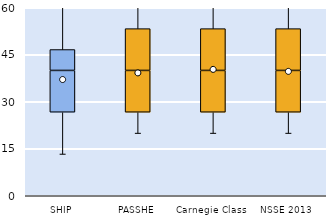
| Category | 25th | 50th | 75th |
|---|---|---|---|
| SHIP | 26.667 | 13.333 | 6.667 |
| PASSHE | 26.667 | 13.333 | 13.333 |
| Carnegie Class | 26.667 | 13.333 | 13.333 |
| NSSE 2013 | 26.667 | 13.333 | 13.333 |